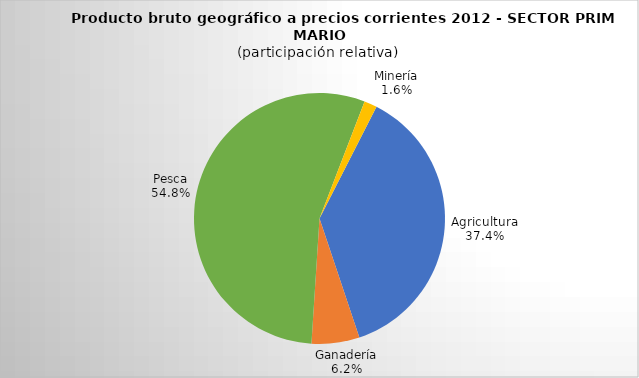
| Category | Series 0 |
|---|---|
| Agricultura | 738.521 |
| Ganadería | 121.903 |
| Pesca | 1083.899 |
| Minería | 32.589 |